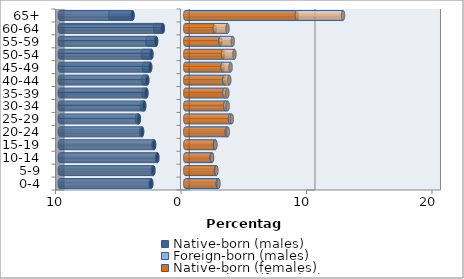
| Category | Native-born (males) | Foreign-born (males) | Native-born (females) | Foreign-born (females) |
|---|---|---|---|---|
| 0-4 | -2.71 | -0.062 | 2.597 | 0.051 |
| 5-9 | -2.541 | -0.04 | 2.448 | 0.035 |
| 10-14 | -2.226 | -0.027 | 2.112 | 0.025 |
| 15-19 | -2.485 | -0.039 | 2.368 | 0.038 |
| 20-24 | -3.44 | -0.083 | 3.309 | 0.081 |
| 25-29 | -3.701 | -0.147 | 3.567 | 0.144 |
| 30-34 | -3.272 | -0.183 | 3.197 | 0.183 |
| 35-39 | -3.099 | -0.221 | 3.117 | 0.241 |
| 40-44 | -3.027 | -0.324 | 3.12 | 0.387 |
| 45-49 | -2.794 | -0.504 | 2.979 | 0.635 |
| 50-54 | -2.696 | -0.692 | 3.019 | 0.902 |
| 55-59 | -2.322 | -0.701 | 2.81 | 0.975 |
| 60-64 | -1.794 | -0.605 | 2.355 | 1.013 |
| 65+ | -4.203 | -1.777 | 8.894 | 3.681 |